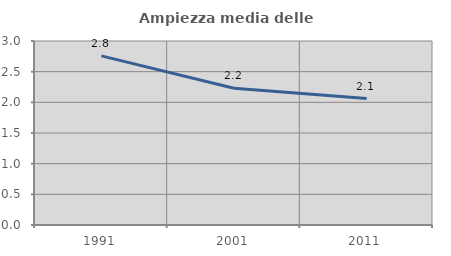
| Category | Ampiezza media delle famiglie |
|---|---|
| 1991.0 | 2.757 |
| 2001.0 | 2.23 |
| 2011.0 | 2.061 |